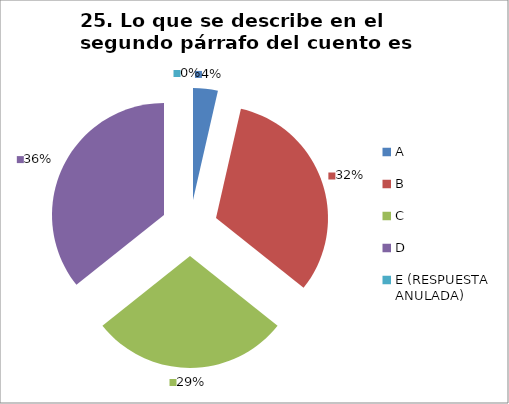
| Category | CANTIDAD DE RESPUESTAS PREGUNTA (23) | PORCENTAJE |
|---|---|---|
| A | 1 | 0.036 |
| B | 9 | 0.321 |
| C | 8 | 0.286 |
| D | 10 | 0.357 |
| E (RESPUESTA ANULADA) | 0 | 0 |